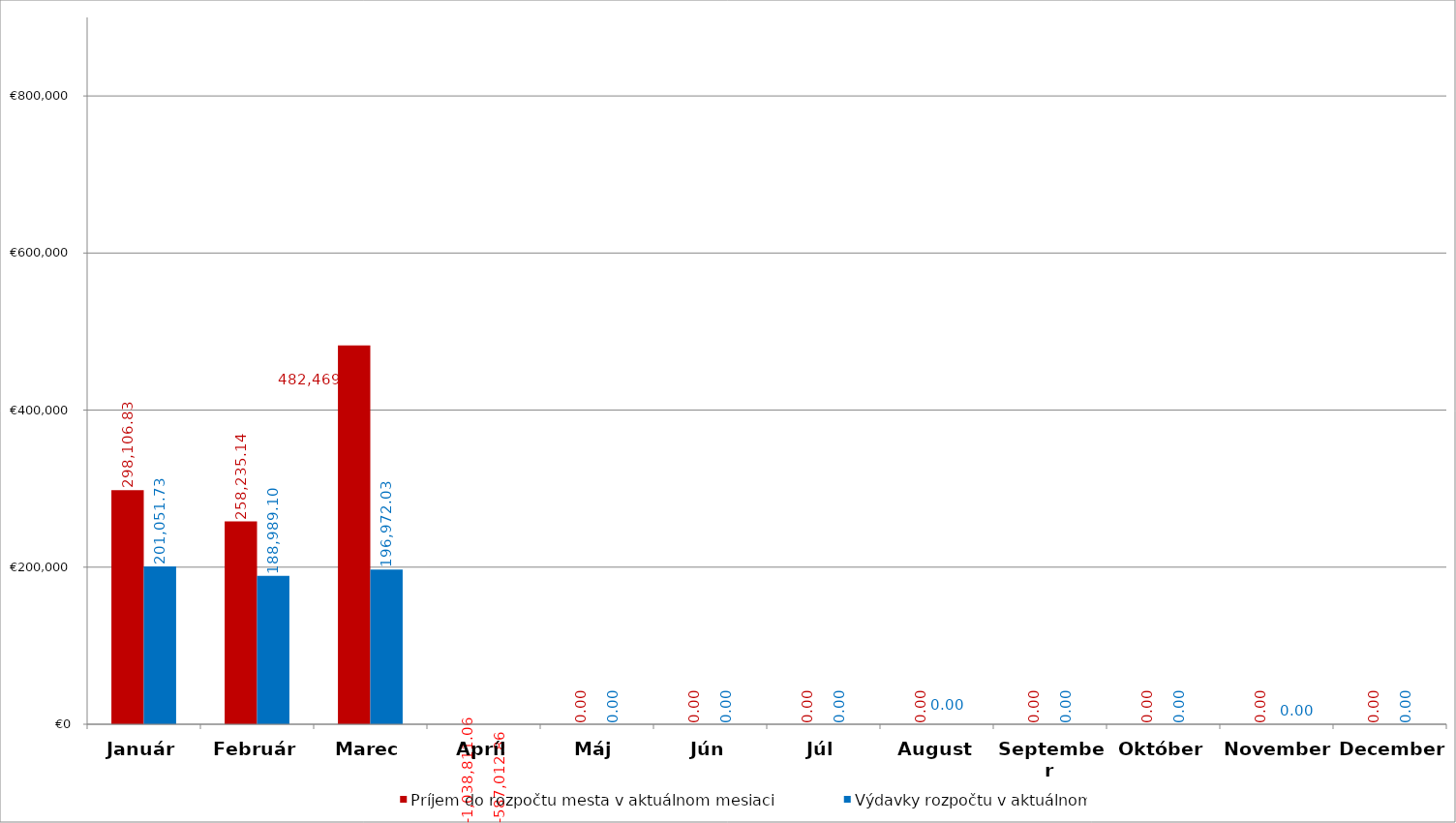
| Category | Príjem do rozpočtu mesta v aktuálnom mesiaci | Výdavky rozpočtu v aktuálnom  mesiaci |
|---|---|---|
| Január | 298106.83 | 201051.73 |
| Február | 258235.14 | 188989.1 |
| Marec | 482469.089 | 196972.03 |
| Apríl | -1038811.059 | -587012.86 |
| Máj | 0 | 0 |
| Jún | 0 | 0 |
| Júl | 0 | 0 |
| August | 0 | 0 |
| September | 0 | 0 |
| Október | 0 | 0 |
| November | 0 | 0 |
| December | 0 | 0 |